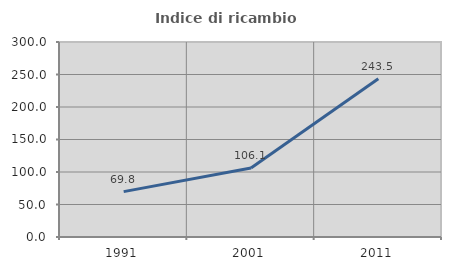
| Category | Indice di ricambio occupazionale  |
|---|---|
| 1991.0 | 69.841 |
| 2001.0 | 106.061 |
| 2011.0 | 243.478 |